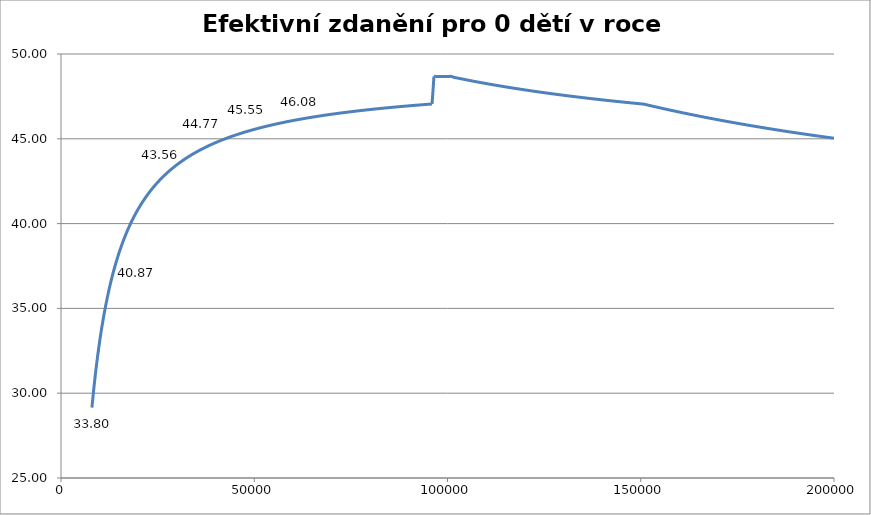
| Category | Efektivní zdanění 2014 |
|---|---|
| 8000.0 | 29.151 |
| 8500.0 | 30.3 |
| 9000.0 | 31.321 |
| 9500.0 | 32.234 |
| 10000.0 | 33.057 |
| 10500.0 | 33.801 |
| 11000.0 | 34.477 |
| 11500.0 | 35.094 |
| 12000.0 | 35.66 |
| 12500.0 | 36.181 |
| 13000.0 | 36.662 |
| 13500.0 | 37.107 |
| 14000.0 | 37.52 |
| 14500.0 | 37.905 |
| 15000.0 | 38.264 |
| 15500.0 | 38.6 |
| 16000.0 | 38.915 |
| 16500.0 | 39.211 |
| 17000.0 | 39.489 |
| 17500.0 | 39.752 |
| 18000.0 | 40 |
| 18500.0 | 40.235 |
| 19000.0 | 40.457 |
| 19500.0 | 40.668 |
| 20000.0 | 40.868 |
| 20500.0 | 41.058 |
| 21000.0 | 41.24 |
| 21500.0 | 41.413 |
| 22000.0 | 41.578 |
| 22500.0 | 41.736 |
| 23000.0 | 41.887 |
| 23500.0 | 42.031 |
| 24000.0 | 42.17 |
| 24500.0 | 42.303 |
| 25000.0 | 42.43 |
| 25500.0 | 42.553 |
| 26000.0 | 42.671 |
| 26500.0 | 42.784 |
| 27000.0 | 42.893 |
| 27500.0 | 42.998 |
| 28000.0 | 43.1 |
| 28500.0 | 43.198 |
| 29000.0 | 43.292 |
| 29500.0 | 43.383 |
| 30000.0 | 43.472 |
| 30500.0 | 43.557 |
| 31000.0 | 43.64 |
| 31500.0 | 43.72 |
| 32000.0 | 43.797 |
| 32500.0 | 43.872 |
| 33000.0 | 43.945 |
| 33500.0 | 44.016 |
| 34000.0 | 44.084 |
| 34500.0 | 44.151 |
| 35000.0 | 44.216 |
| 35500.0 | 44.279 |
| 36000.0 | 44.34 |
| 36500.0 | 44.399 |
| 37000.0 | 44.457 |
| 37500.0 | 44.513 |
| 38000.0 | 44.568 |
| 38500.0 | 44.621 |
| 39000.0 | 44.673 |
| 39500.0 | 44.724 |
| 40000.0 | 44.774 |
| 40500.0 | 44.822 |
| 41000.0 | 44.869 |
| 41500.0 | 44.915 |
| 42000.0 | 44.96 |
| 42500.0 | 45.003 |
| 43000.0 | 45.046 |
| 43500.0 | 45.088 |
| 44000.0 | 45.129 |
| 44500.0 | 45.169 |
| 45000.0 | 45.208 |
| 45500.0 | 45.246 |
| 46000.0 | 45.283 |
| 46500.0 | 45.32 |
| 47000.0 | 45.355 |
| 47500.0 | 45.39 |
| 48000.0 | 45.425 |
| 48500.0 | 45.458 |
| 49000.0 | 45.491 |
| 49500.0 | 45.523 |
| 50000.0 | 45.555 |
| 50500.0 | 45.586 |
| 51000.0 | 45.616 |
| 51500.0 | 45.646 |
| 52000.0 | 45.675 |
| 52500.0 | 45.704 |
| 53000.0 | 45.732 |
| 53500.0 | 45.759 |
| 54000.0 | 45.786 |
| 54500.0 | 45.813 |
| 55000.0 | 45.839 |
| 55500.0 | 45.864 |
| 56000.0 | 45.889 |
| 56500.0 | 45.914 |
| 57000.0 | 45.938 |
| 57500.0 | 45.962 |
| 58000.0 | 45.986 |
| 58500.0 | 46.009 |
| 59000.0 | 46.031 |
| 59500.0 | 46.054 |
| 60000.0 | 46.075 |
| 60500.0 | 46.097 |
| 61000.0 | 46.118 |
| 61500.0 | 46.139 |
| 62000.0 | 46.159 |
| 62500.0 | 46.18 |
| 63000.0 | 46.199 |
| 63500.0 | 46.219 |
| 64000.0 | 46.238 |
| 64500.0 | 46.257 |
| 65000.0 | 46.276 |
| 65500.0 | 46.294 |
| 66000.0 | 46.312 |
| 66500.0 | 46.33 |
| 67000.0 | 46.348 |
| 67500.0 | 46.365 |
| 68000.0 | 46.382 |
| 68500.0 | 46.399 |
| 69000.0 | 46.415 |
| 69500.0 | 46.431 |
| 70000.0 | 46.447 |
| 70500.0 | 46.463 |
| 71000.0 | 46.479 |
| 71500.0 | 46.494 |
| 72000.0 | 46.509 |
| 72500.0 | 46.524 |
| 73000.0 | 46.539 |
| 73500.0 | 46.554 |
| 74000.0 | 46.568 |
| 74500.0 | 46.582 |
| 75000.0 | 46.596 |
| 75500.0 | 46.61 |
| 76000.0 | 46.624 |
| 76500.0 | 46.637 |
| 77000.0 | 46.65 |
| 77500.0 | 46.663 |
| 78000.0 | 46.676 |
| 78500.0 | 46.689 |
| 79000.0 | 46.702 |
| 79500.0 | 46.714 |
| 80000.0 | 46.726 |
| 80500.0 | 46.739 |
| 81000.0 | 46.751 |
| 81500.0 | 46.762 |
| 82000.0 | 46.774 |
| 82500.0 | 46.786 |
| 83000.0 | 46.797 |
| 83500.0 | 46.808 |
| 84000.0 | 46.819 |
| 84500.0 | 46.83 |
| 85000.0 | 46.841 |
| 85500.0 | 46.852 |
| 86000.0 | 46.863 |
| 86500.0 | 46.873 |
| 87000.0 | 46.884 |
| 87500.0 | 46.894 |
| 88000.0 | 46.904 |
| 88500.0 | 46.914 |
| 89000.0 | 46.924 |
| 89500.0 | 46.934 |
| 90000.0 | 46.943 |
| 90500.0 | 46.953 |
| 91000.0 | 46.962 |
| 91500.0 | 46.972 |
| 92000.0 | 46.981 |
| 92500.0 | 46.99 |
| 93000.0 | 46.999 |
| 93500.0 | 47.008 |
| 94000.0 | 47.017 |
| 94500.0 | 47.026 |
| 95000.0 | 47.035 |
| 95500.0 | 47.043 |
| 96000.0 | 47.052 |
| 96500.0 | 48.679 |
| 97000.0 | 48.679 |
| 97500.0 | 48.679 |
| 98000.0 | 48.679 |
| 98500.0 | 48.679 |
| 99000.0 | 48.679 |
| 99500.0 | 48.679 |
| 100000.0 | 48.679 |
| 100500.0 | 48.679 |
| 101000.0 | 48.679 |
| 101500.0 | 48.633 |
| 102000.0 | 48.609 |
| 102500.0 | 48.586 |
| 103000.0 | 48.562 |
| 103500.0 | 48.539 |
| 104000.0 | 48.516 |
| 104500.0 | 48.494 |
| 105000.0 | 48.471 |
| 105500.0 | 48.449 |
| 106000.0 | 48.427 |
| 106500.0 | 48.405 |
| 107000.0 | 48.383 |
| 107500.0 | 48.362 |
| 108000.0 | 48.341 |
| 108500.0 | 48.32 |
| 109000.0 | 48.299 |
| 109500.0 | 48.278 |
| 110000.0 | 48.258 |
| 110500.0 | 48.237 |
| 111000.0 | 48.217 |
| 111500.0 | 48.197 |
| 112000.0 | 48.178 |
| 112500.0 | 48.158 |
| 113000.0 | 48.139 |
| 113500.0 | 48.119 |
| 114000.0 | 48.1 |
| 114500.0 | 48.081 |
| 115000.0 | 48.063 |
| 115500.0 | 48.044 |
| 116000.0 | 48.026 |
| 116500.0 | 48.007 |
| 117000.0 | 47.989 |
| 117500.0 | 47.971 |
| 118000.0 | 47.954 |
| 118500.0 | 47.936 |
| 119000.0 | 47.919 |
| 119500.0 | 47.901 |
| 120000.0 | 47.884 |
| 120500.0 | 47.867 |
| 121000.0 | 47.85 |
| 121500.0 | 47.833 |
| 122000.0 | 47.817 |
| 122500.0 | 47.8 |
| 123000.0 | 47.784 |
| 123500.0 | 47.768 |
| 124000.0 | 47.751 |
| 124500.0 | 47.735 |
| 125000.0 | 47.72 |
| 125500.0 | 47.704 |
| 126000.0 | 47.688 |
| 126500.0 | 47.673 |
| 127000.0 | 47.657 |
| 127500.0 | 47.642 |
| 128000.0 | 47.627 |
| 128500.0 | 47.612 |
| 129000.0 | 47.597 |
| 129500.0 | 47.582 |
| 130000.0 | 47.568 |
| 130500.0 | 47.553 |
| 131000.0 | 47.539 |
| 131500.0 | 47.525 |
| 132000.0 | 47.51 |
| 132500.0 | 47.496 |
| 133000.0 | 47.482 |
| 133500.0 | 47.468 |
| 134000.0 | 47.455 |
| 134500.0 | 47.441 |
| 135000.0 | 47.427 |
| 135500.0 | 47.414 |
| 136000.0 | 47.4 |
| 136500.0 | 47.387 |
| 137000.0 | 47.374 |
| 137500.0 | 47.361 |
| 138000.0 | 47.348 |
| 138500.0 | 47.335 |
| 139000.0 | 47.322 |
| 139500.0 | 47.309 |
| 140000.0 | 47.297 |
| 140500.0 | 47.284 |
| 141000.0 | 47.272 |
| 141500.0 | 47.259 |
| 142000.0 | 47.247 |
| 142500.0 | 47.235 |
| 143000.0 | 47.223 |
| 143500.0 | 47.211 |
| 144000.0 | 47.199 |
| 144500.0 | 47.187 |
| 145000.0 | 47.175 |
| 145500.0 | 47.164 |
| 146000.0 | 47.152 |
| 146500.0 | 47.14 |
| 147000.0 | 47.129 |
| 147500.0 | 47.118 |
| 148000.0 | 47.106 |
| 148500.0 | 47.095 |
| 149000.0 | 47.084 |
| 149500.0 | 47.073 |
| 150000.0 | 47.062 |
| 150500.0 | 47.051 |
| 151000.0 | 47.034 |
| 151500.0 | 47.007 |
| 152000.0 | 46.981 |
| 152500.0 | 46.954 |
| 153000.0 | 46.928 |
| 153500.0 | 46.901 |
| 154000.0 | 46.875 |
| 154500.0 | 46.849 |
| 155000.0 | 46.824 |
| 155500.0 | 46.798 |
| 156000.0 | 46.773 |
| 156500.0 | 46.747 |
| 157000.0 | 46.722 |
| 157500.0 | 46.697 |
| 158000.0 | 46.673 |
| 158500.0 | 46.648 |
| 159000.0 | 46.623 |
| 159500.0 | 46.599 |
| 160000.0 | 46.575 |
| 160500.0 | 46.551 |
| 161000.0 | 46.527 |
| 161500.0 | 46.503 |
| 162000.0 | 46.48 |
| 162500.0 | 46.456 |
| 163000.0 | 46.433 |
| 163500.0 | 46.41 |
| 164000.0 | 46.387 |
| 164500.0 | 46.364 |
| 165000.0 | 46.341 |
| 165500.0 | 46.319 |
| 166000.0 | 46.296 |
| 166500.0 | 46.274 |
| 167000.0 | 46.252 |
| 167500.0 | 46.23 |
| 168000.0 | 46.208 |
| 168500.0 | 46.186 |
| 169000.0 | 46.165 |
| 169500.0 | 46.143 |
| 170000.0 | 46.122 |
| 170500.0 | 46.1 |
| 171000.0 | 46.079 |
| 171500.0 | 46.058 |
| 172000.0 | 46.037 |
| 172500.0 | 46.017 |
| 173000.0 | 45.996 |
| 173500.0 | 45.975 |
| 174000.0 | 45.955 |
| 174500.0 | 45.935 |
| 175000.0 | 45.914 |
| 175500.0 | 45.894 |
| 176000.0 | 45.874 |
| 176500.0 | 45.855 |
| 177000.0 | 45.835 |
| 177500.0 | 45.815 |
| 178000.0 | 45.796 |
| 178500.0 | 45.776 |
| 179000.0 | 45.757 |
| 179500.0 | 45.738 |
| 180000.0 | 45.719 |
| 180500.0 | 45.7 |
| 181000.0 | 45.681 |
| 181500.0 | 45.662 |
| 182000.0 | 45.643 |
| 182500.0 | 45.625 |
| 183000.0 | 45.606 |
| 183500.0 | 45.588 |
| 184000.0 | 45.57 |
| 184500.0 | 45.552 |
| 185000.0 | 45.533 |
| 185500.0 | 45.516 |
| 186000.0 | 45.498 |
| 186500.0 | 45.48 |
| 187000.0 | 45.462 |
| 187500.0 | 45.445 |
| 188000.0 | 45.427 |
| 188500.0 | 45.41 |
| 189000.0 | 45.392 |
| 189500.0 | 45.375 |
| 190000.0 | 45.358 |
| 190500.0 | 45.341 |
| 191000.0 | 45.324 |
| 191500.0 | 45.307 |
| 192000.0 | 45.29 |
| 192500.0 | 45.274 |
| 193000.0 | 45.257 |
| 193500.0 | 45.241 |
| 194000.0 | 45.224 |
| 194500.0 | 45.208 |
| 195000.0 | 45.192 |
| 195500.0 | 45.175 |
| 196000.0 | 45.159 |
| 196500.0 | 45.143 |
| 197000.0 | 45.127 |
| 197500.0 | 45.112 |
| 198000.0 | 45.096 |
| 198500.0 | 45.08 |
| 199000.0 | 45.065 |
| 199500.0 | 45.049 |
| 200000.0 | 45.034 |